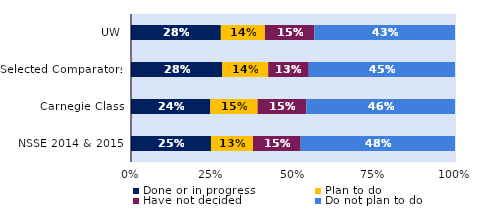
| Category | Done or in progress | Plan to do | Have not decided | Do not plan to do |
|---|---|---|---|---|
| UW | 0.277 | 0.136 | 0.153 | 0.434 |
| Selected Comparators | 0.282 | 0.142 | 0.125 | 0.451 |
| Carnegie Class | 0.245 | 0.146 | 0.15 | 0.459 |
| NSSE 2014 & 2015 | 0.247 | 0.13 | 0.147 | 0.476 |